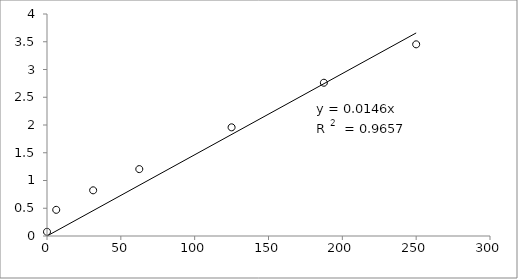
| Category | Series 0 |
|---|---|
| 250.0 | 3.454 |
| 187.5 | 2.762 |
| 125.0 | 1.958 |
| 62.5 | 1.205 |
| 31.25 | 0.823 |
| 6.25 | 0.472 |
| 0.0 | 0.076 |